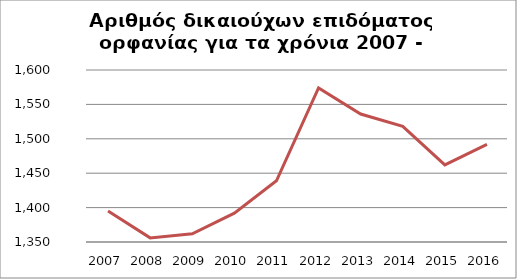
| Category |  1.395      |
|---|---|
| 2007.0 | 1395 |
| 2008.0 | 1356 |
| 2009.0 | 1362 |
| 2010.0 | 1392 |
| 2011.0 | 1439 |
| 2012.0 | 1574 |
| 2013.0 | 1536 |
| 2014.0 | 1518 |
| 2015.0 | 1462 |
| 2016.0 | 1492 |